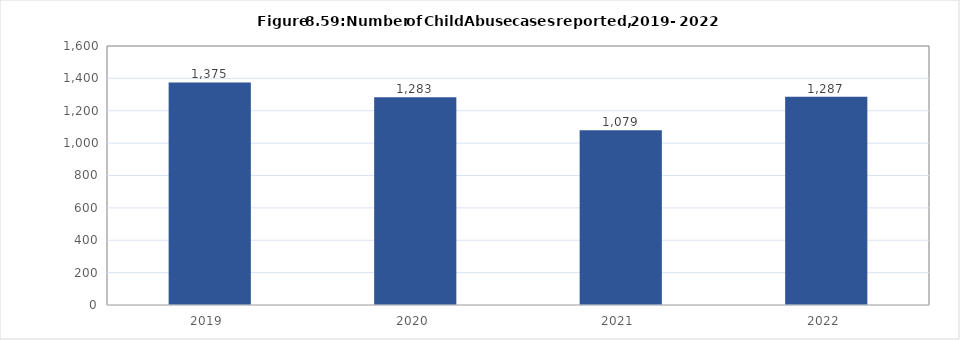
| Category | Series 1 |
|---|---|
| 2019.0 | 1375 |
| 2020.0 | 1283 |
| 2021.0 | 1079 |
| 2022.0 | 1287 |